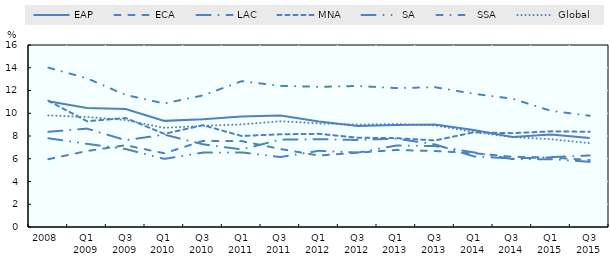
| Category | EAP | ECA | LAC | MNA | SA | SSA | Global |
|---|---|---|---|---|---|---|---|
| 2008 | 11.05 | 5.96 | 8.37 | 11.1 | 7.8 | 14.01 | 9.81 |
| Q1 2009 | 10.46 | 6.68 | 8.65 | 9.3 | 7.31 | 13.07 | 9.67 |
| Q3 2009 | 10.38 | 7.19 | 7.63 | 9.58 | 6.85 | 11.61 | 9.4 |
| Q1 2010 | 9.33 | 6.48 | 8.12 | 8.19 | 5.99 | 10.86 | 8.72 |
| Q3 2010 | 9.48 | 7.57 | 7.27 | 8.95 | 6.54 | 11.57 | 8.89 |
| Q1 2011 | 9.71 | 7.55 | 6.82 | 8 | 6.56 | 12.82 | 9.02 |
| Q3 2011 | 9.8 | 6.86 | 7.68 | 8.15 | 6.15 | 12.41 | 9.3 |
| Q1 2012 | 9.27 | 6.28 | 7.72 | 8.19 | 6.7 | 12.32 | 9.11 |
| Q3 2012 | 8.88 | 6.54 | 7.65 | 7.85 | 6.54 | 12.4 | 9 |
| Q1 2013 | 8.97 | 6.77 | 7.77 | 7.81 | 7.16 | 12.21 | 9.05 |
| Q3 2013 | 9 | 6.68 | 7.26 | 7.61 | 7.12 | 12.29 | 8.93 |
| Q1 2014 | 8.52 | 6.49 | 6.21 | 8.32 | 6.56 | 11.71 | 8.36 |
| Q3 2014 | 7.92 | 6.17 | 6.02 | 8.25 | 5.97 | 11.28 | 7.9 |
| Q1 2015 | 8.13 | 6.11 | 6.14 | 8.41 | 5.96 | 10.21 | 7.72 |
| Q3 2015 | 7.82 | 5.89 | 6.29 | 8.37 | 5.73 | 9.78 | 7.37 |